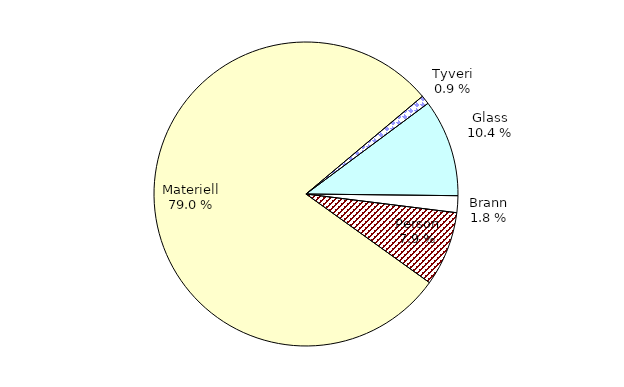
| Category | Series 0 |
|---|---|
| Tyveri | 114.368 |
| Glass | 1263.672 |
| Brann | 218.663 |
| Person | 969.25 |
| Materiell | 9641.19 |